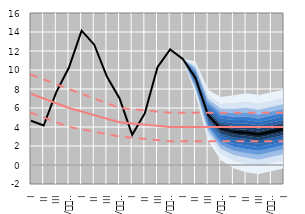
| Category | Series 5 | Series 20 | Series 21 | Series 22 |
|---|---|---|---|---|
| 0 | 4.655 | 9.5 | 5.5 | 7.5 |
| 1 | 4.16 | 9 | 5 | 7 |
| 2 | 7.669 | 8.5 | 4.5 | 6.5 |
| 3 | 10.264 | 8 | 4 | 6 |
| 4 | 14.144 | 7.5 | 3.75 | 5.625 |
| 5 | 12.664 | 7 | 3.5 | 5.25 |
| 6 | 9.311 | 6.5 | 3.25 | 4.875 |
| 7 | 7 | 6 | 3 | 4.5 |
| 8 | 3.182 | 5.875 | 2.875 | 4.375 |
| 9 | 5.456 | 5.75 | 2.75 | 4.25 |
| 10 | 10.294 | 5.625 | 2.625 | 4.125 |
| 11 | 12.172 | 5.5 | 2.5 | 4 |
| 12 | 11.176 | 5.5 | 2.5 | 4 |
| 13 | 9.16 | 5.5 | 2.5 | 4 |
| 14 | 5.254 | 5.5 | 2.5 | 4 |
| 15 | 3.835 | 5.5 | 2.5 | 4 |
| 16 | 3.5 | 5.5 | 2.5 | 4 |
| 17 | 3.4 | 5.5 | 2.5 | 4 |
| 18 | 3.2 | 5.5 | 2.5 | 4 |
| 19 | 3.5 | 5.5 | 2.5 | 4 |
| 20 | 3.8 | 5.5 | 2.5 | 4 |